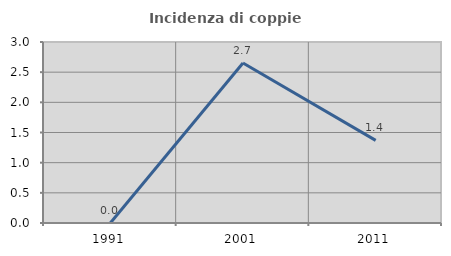
| Category | Incidenza di coppie miste |
|---|---|
| 1991.0 | 0 |
| 2001.0 | 2.652 |
| 2011.0 | 1.37 |